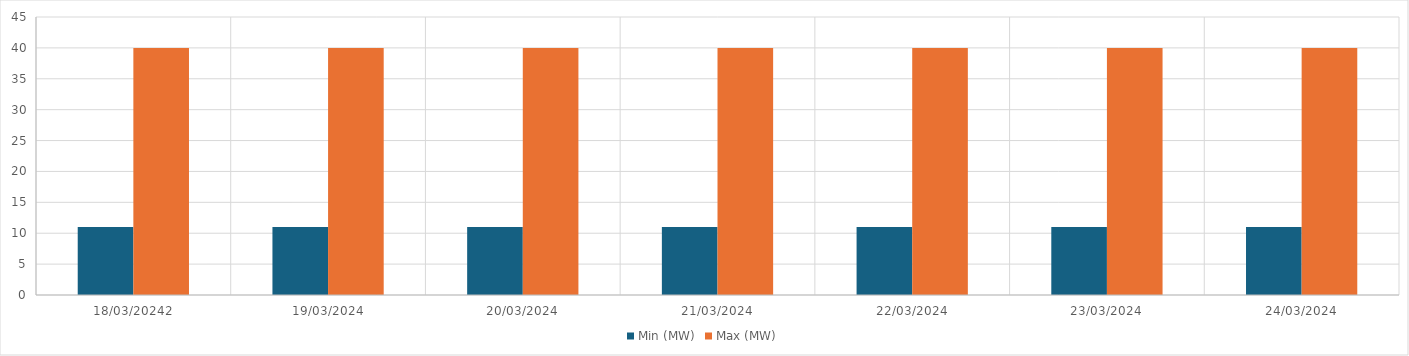
| Category | Min (MW) | Max (MW) |
|---|---|---|
| 18/03/20242 | 11 | 40 |
| 19/03/2024 | 11 | 40 |
| 20/03/2024 | 11 | 40 |
| 21/03/2024 | 11 | 40 |
| 22/03/2024 | 11 | 40 |
| 23/03/2024 | 11 | 40 |
| 24/03/2024 | 11 | 40 |